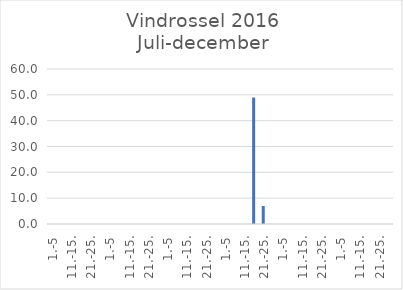
| Category | Series 0 |
|---|---|
| 1.-5 | 0 |
| 6.-10. | 0 |
| 11.-15. | 0 |
| 16.-20. | 0 |
| 21.-25. | 0 |
| 26.-31. | 0 |
| 1.-5 | 0 |
| 6.-10. | 0 |
| 11.-15. | 0 |
| 16.-20. | 0 |
| 21.-25. | 0 |
| 26.-31. | 0 |
| 1.-5 | 0 |
| 6.-10. | 0 |
| 11.-15. | 0 |
| 16.-20. | 0 |
| 21.-25. | 0 |
| 26.-30. | 0 |
| 1.-5 | 0 |
| 6.-10. | 0 |
| 11.-15. | 0 |
| 16.-20. | 48.951 |
| 21.-25. | 6.965 |
| 26.-31. | 0 |
| 1.-5 | 0 |
| 6.-10. | 0 |
| 11.-15. | 0 |
| 16.-20. | 0 |
| 21.-25. | 0 |
| 26.-30. | 0 |
| 1.-5 | 0 |
| 6.-10. | 0 |
| 11.-15. | 0 |
| 16.-20. | 0 |
| 21.-25. | 0 |
| 26.-31. | 0 |